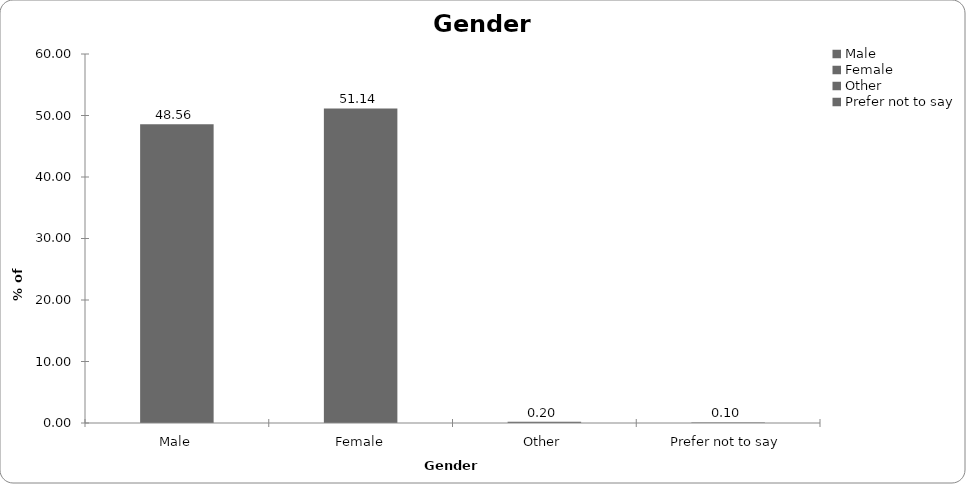
| Category | Series 0 |
|---|---|
| Male | 48.557 |
| Female | 51.144 |
| Other | 0.199 |
| Prefer not to say | 0.1 |